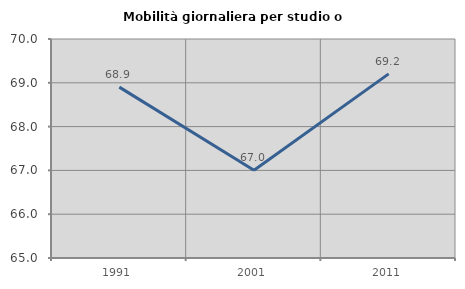
| Category | Mobilità giornaliera per studio o lavoro |
|---|---|
| 1991.0 | 68.902 |
| 2001.0 | 67.003 |
| 2011.0 | 69.203 |